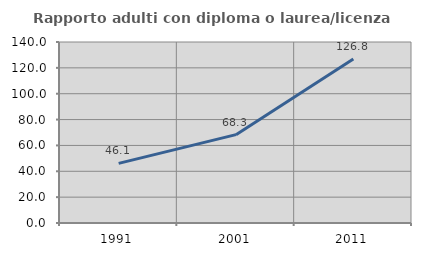
| Category | Rapporto adulti con diploma o laurea/licenza media  |
|---|---|
| 1991.0 | 46.091 |
| 2001.0 | 68.338 |
| 2011.0 | 126.77 |